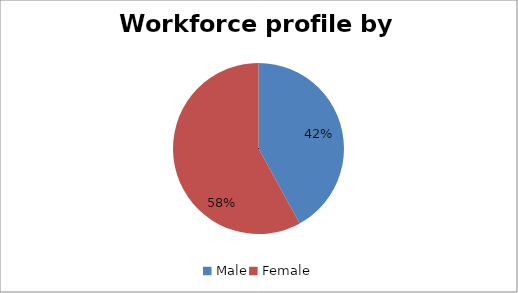
| Category | Series 1 |
|---|---|
| Male | 0.42 |
| Female | 0.58 |